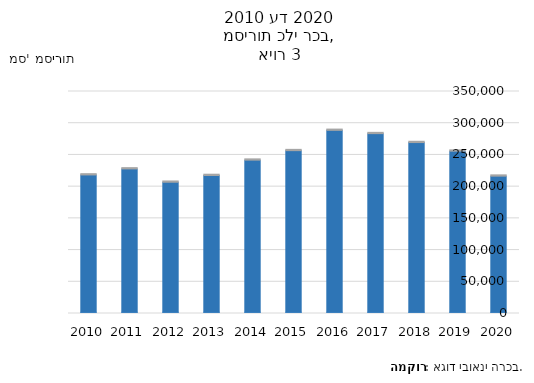
| Category | מסירות כלי רכב | שנה |
|---|---|---|
| 2020.0 | 214544 | 2020 |
| 2019.0 | 253938 | 2019 |
| 2018.0 | 267490 | 2018 |
| 2017.0 | 281563 | 2017 |
| 2016.0 | 286728 | 2016 |
| 2015.0 | 254748 | 2015 |
| 2014.0 | 239771 | 2014 |
| 2013.0 | 215581 | 2013 |
| 2012.0 | 204939 | 2012 |
| 2011.0 | 225949 | 2011 |
| 2010.0 | 216430 | 2010 |